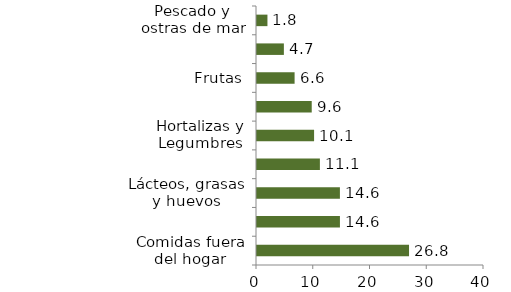
| Category | Alimentos |
|---|---|
| Comidas fuera del hogar | 26.79 |
| Carnes y derivados de la carne | 14.614 |
| Lácteos, grasas y huevos | 14.61 |
| Alimentos varios | 11.082 |
| Hortalizas y Legumbres | 10.059 |
| Cereales y productos de panadería | 9.645 |
| Frutas | 6.625 |
| Tubérculos y plátanos | 4.735 |
| Pescado y ostras de mar | 1.84 |